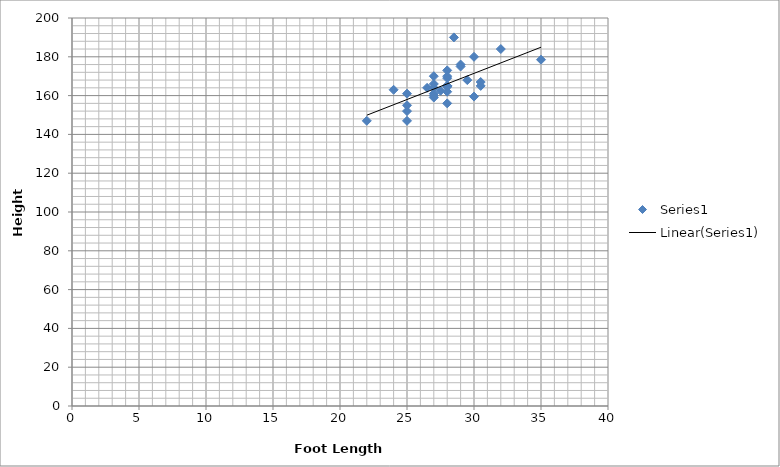
| Category | Series 0 |
|---|---|
| 28.0 | 156 |
| 28.0 | 169 |
| 26.5 | 164 |
| 28.0 | 164.5 |
| 29.5 | 168 |
| 27.5 | 162.5 |
| 32.0 | 184 |
| 30.0 | 180 |
| 28.0 | 170 |
| 28.0 | 165 |
| 27.0 | 170 |
| 28.0 | 165 |
| 35.0 | 178.5 |
| 28.0 | 173 |
| 30.0 | 159.5 |
| 27.0 | 160 |
| 25.0 | 155 |
| 29.0 | 176 |
| 29.0 | 175 |
| 28.0 | 165 |
| 25.0 | 147 |
| 27.0 | 164 |
| 27.0 | 159 |
| 28.5 | 190 |
| 28.0 | 162 |
| 24.0 | 163 |
| 27.0 | 161 |
| 30.5 | 165 |
| 30.5 | 167 |
| 22.0 | 147 |
| 27.0 | 166 |
| 25.0 | 161 |
| 25.0 | 152 |